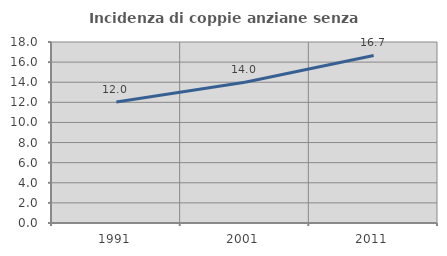
| Category | Incidenza di coppie anziane senza figli  |
|---|---|
| 1991.0 | 12.037 |
| 2001.0 | 14 |
| 2011.0 | 16.667 |